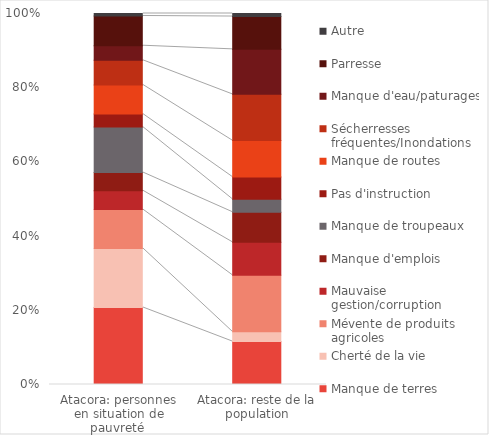
| Category | Manque de terres | Cherté de la vie | Mévente de produits agricoles | Mauvaise gestion/corruption | Manque d'emplois | Manque de troupeaux | Pas d'instruction | Manque de routes | Sécherresses fréquentes/Inondations | Manque d'eau/paturages | Parresse | Autre |
|---|---|---|---|---|---|---|---|---|---|---|---|---|
| Atacora: personnes en situation de pauvreté  | 0.597 | 0.458 | 0.301 | 0.146 | 0.141 | 0.352 | 0.102 | 0.226 | 0.191 | 0.113 | 0.231 | 0.019 |
| Atacora: reste de la population | 0.337 | 0.077 | 0.443 | 0.258 | 0.236 | 0.101 | 0.174 | 0.285 | 0.362 | 0.352 | 0.257 | 0.024 |